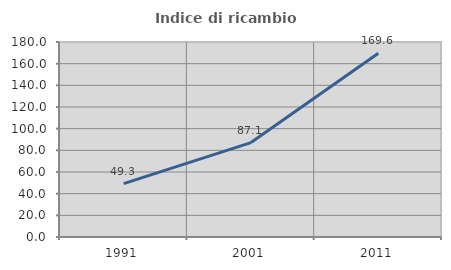
| Category | Indice di ricambio occupazionale  |
|---|---|
| 1991.0 | 49.261 |
| 2001.0 | 87.147 |
| 2011.0 | 169.587 |